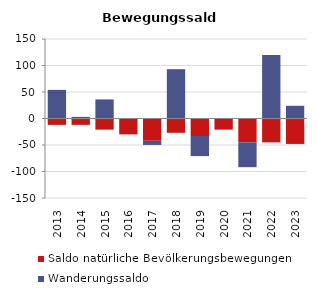
| Category | Saldo natürliche Bevölkerungsbewegungen | Wanderungssaldo |
|---|---|---|
| 2013.0 | -12 | 54 |
| 2014.0 | -12 | 3 |
| 2015.0 | -21 | 36 |
| 2016.0 | -30 | 0 |
| 2017.0 | -42 | -6 |
| 2018.0 | -27 | 93 |
| 2019.0 | -33 | -36 |
| 2020.0 | -21 | 0 |
| 2021.0 | -45 | -45 |
| 2022.0 | -45 | 120 |
| 2023.0 | -48 | 24 |